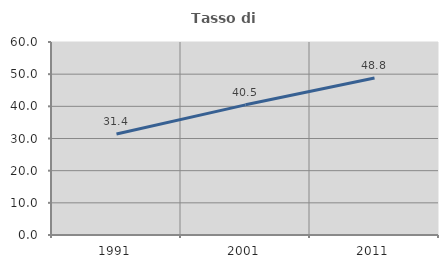
| Category | Tasso di occupazione   |
|---|---|
| 1991.0 | 31.421 |
| 2001.0 | 40.464 |
| 2011.0 | 48.806 |